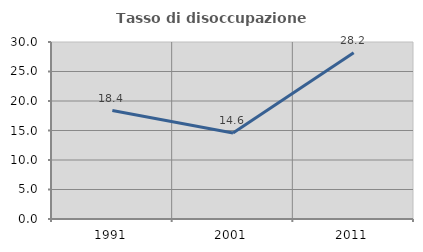
| Category | Tasso di disoccupazione giovanile  |
|---|---|
| 1991.0 | 18.373 |
| 2001.0 | 14.563 |
| 2011.0 | 28.191 |